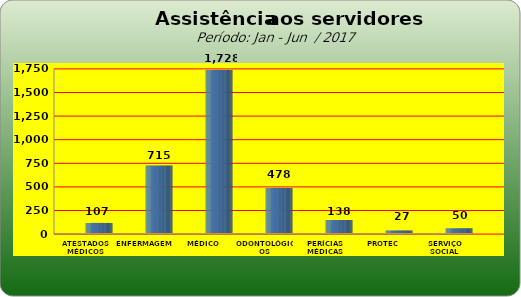
| Category | Series 0 |
|---|---|
| ATESTADOS MÉDICOS | 107 |
| ENFERMAGEM | 715 |
| MÉDICO | 1728 |
| ODONTOLÓGICOS | 478 |
| PERÍCIAS MÉDICAS | 138 |
| PROTEC | 27 |
| SERVIÇO SOCIAL | 50 |